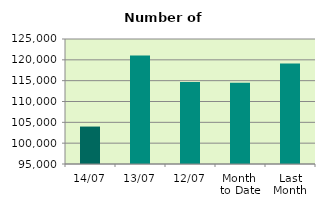
| Category | Series 0 |
|---|---|
| 14/07 | 103986 |
| 13/07 | 121062 |
| 12/07 | 114688 |
| Month 
to Date | 114517 |
| Last
Month | 119107.818 |